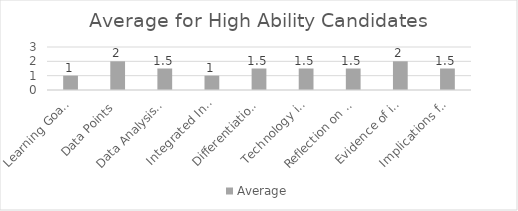
| Category | Average |
|---|---|
| Learning Goals Aligned with Pre-/Post-assessments ACEI 4.0 | 1 |
| Data Points | 2 |
| Data Analysis for Pedagogical Decisions ACEI 4.0 | 1.5 |
| Integrated Instruction ACEI 3.1 | 1 |
| Differentiation based on knowledge of individual learning ACEI 3.2 | 1.5 |
| Technology integration | 1.5 |
| Reflection on pedagogical decisions ACEI 1.0 | 1.5 |
| Evidence of impact on student learning ACEI 5.1 | 2 |
| Implications for teaching and professional development ACEI 5.1 | 1.5 |